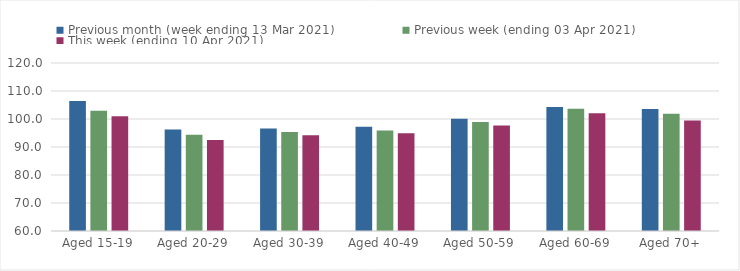
| Category | Previous month (week ending 13 Mar 2021) | Previous week (ending 03 Apr 2021) | This week (ending 10 Apr 2021) |
|---|---|---|---|
| Aged 15-19 | 106.47 | 102.95 | 100.96 |
| Aged 20-29 | 96.25 | 94.39 | 92.49 |
| Aged 30-39 | 96.63 | 95.33 | 94.16 |
| Aged 40-49 | 97.19 | 95.93 | 94.92 |
| Aged 50-59 | 100.11 | 98.95 | 97.66 |
| Aged 60-69 | 104.25 | 103.63 | 102.05 |
| Aged 70+ | 103.61 | 101.85 | 99.46 |